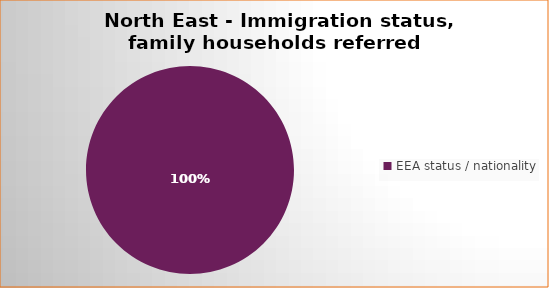
| Category | Number  | Percentage |
|---|---|---|
| EEA status / nationality  | 1 | 1 |